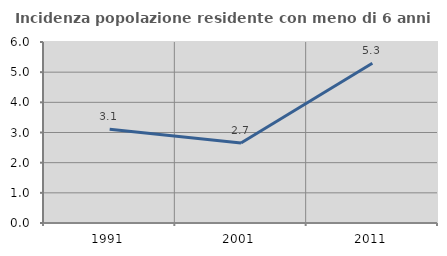
| Category | Incidenza popolazione residente con meno di 6 anni |
|---|---|
| 1991.0 | 3.106 |
| 2001.0 | 2.655 |
| 2011.0 | 5.294 |